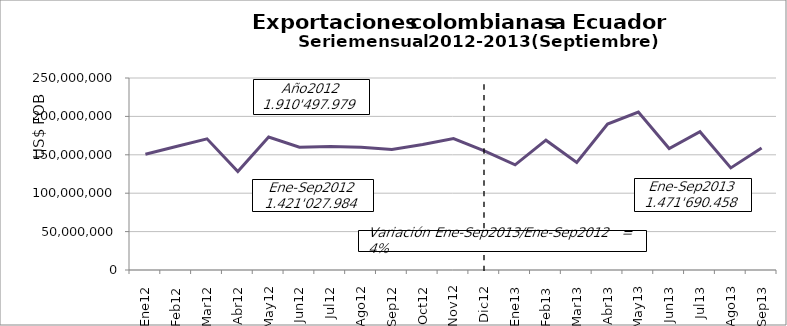
| Category | Series 0 |
|---|---|
| 0 | 150804016.26 |
| 1 | 160704431.13 |
| 2 | 170780027 |
| 3 | 128097699.5 |
| 4 | 173125068.61 |
| 5 | 159903535.9 |
| 6 | 160885915.47 |
| 7 | 159745928.06 |
| 8 | 156981361.97 |
| 9 | 163302477.07 |
| 10 | 171062497.19 |
| 11 | 155105020.63 |
| 12 | 136898071.34 |
| 13 | 169033464.67 |
| 14 | 140076333.84 |
| 15 | 190056491.57 |
| 16 | 205630854.28 |
| 17 | 158174859.92 |
| 18 | 179987613.03 |
| 19 | 132957190.99 |
| 20 | 158875578.65 |